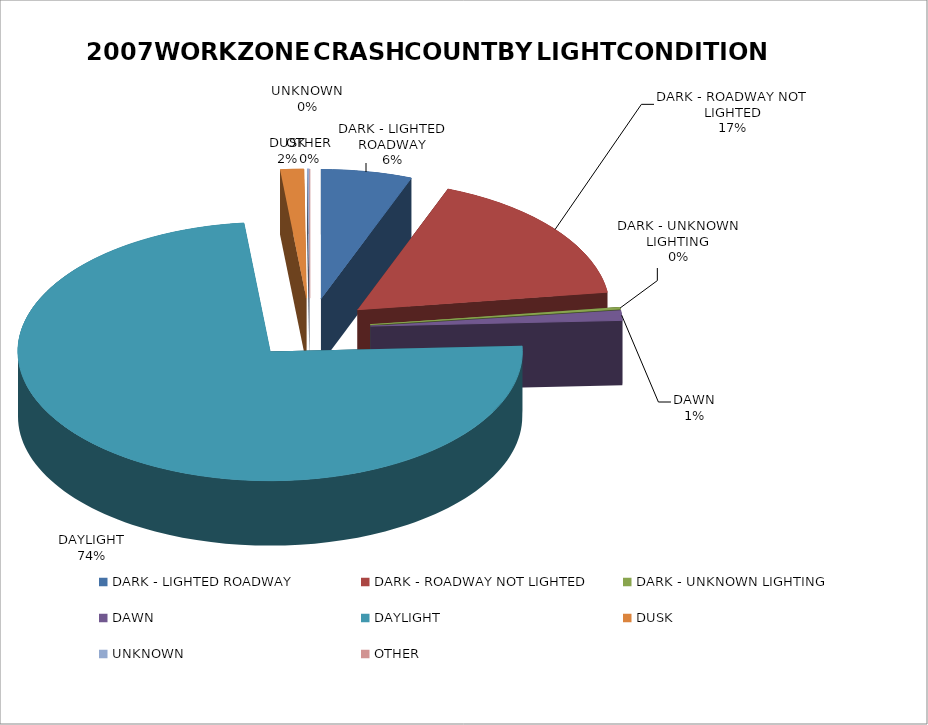
| Category | Series 0 | Series 1 |
|---|---|---|
| DARK - LIGHTED ROADWAY | 365 | 0.058 |
| DARK - ROADWAY NOT LIGHTED | 1064 | 0.17 |
| DARK - UNKNOWN LIGHTING | 14 | 0.002 |
| DAWN | 78 | 0.012 |
| DAYLIGHT | 4633 | 0.74 |
| DUSK | 94 | 0.015 |
| UNKNOWN | 10 | 0.002 |
| OTHER | 0 | 0 |